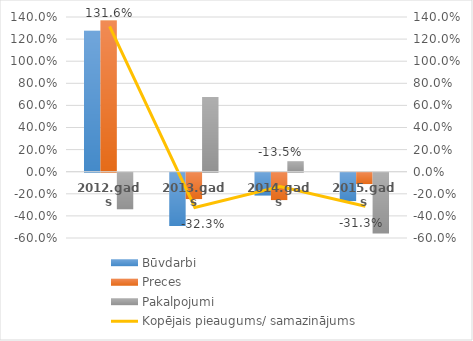
| Category | Būvdarbi | Preces | Pakalpojumi |
|---|---|---|---|
| 2012.gads | 1.275 | 1.368 | -0.332 |
| 2013.gads | -0.483 | -0.239 | 0.675 |
| 2014.gads | -0.207 | -0.248 | 0.095 |
| 2015.gads | -0.257 | -0.103 | -0.551 |